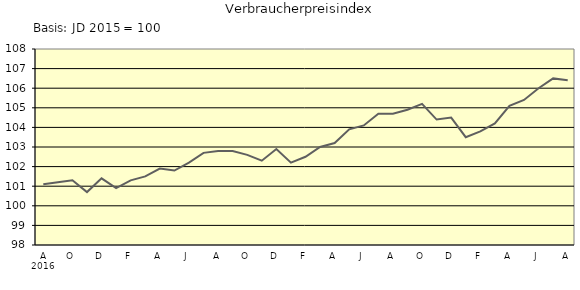
| Category | Series 0 |
|---|---|
| 0 | 101.1 |
| 1 | 101.2 |
| 2 | 101.3 |
| 3 | 100.7 |
| 4 | 101.4 |
| 5 | 100.9 |
| 6 | 101.3 |
| 7 | 101.5 |
| 8 | 101.9 |
| 9 | 101.8 |
| 10 | 102.2 |
| 11 | 102.7 |
| 12 | 102.8 |
| 13 | 102.8 |
| 14 | 102.6 |
| 15 | 102.3 |
| 16 | 102.9 |
| 17 | 102.2 |
| 18 | 102.5 |
| 19 | 103 |
| 20 | 103.2 |
| 21 | 103.9 |
| 22 | 104.1 |
| 23 | 104.7 |
| 24 | 104.7 |
| 25 | 104.9 |
| 26 | 105.2 |
| 27 | 104.4 |
| 28 | 104.5 |
| 29 | 103.5 |
| 30 | 103.8 |
| 31 | 104.2 |
| 32 | 105.1 |
| 33 | 105.4 |
| 34 | 106 |
| 35 | 106.5 |
| 36 | 106.4 |